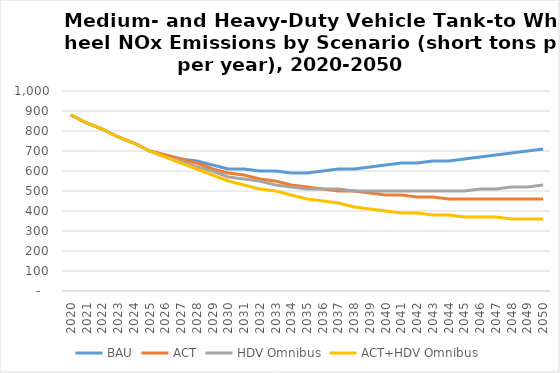
| Category | BAU | ACT | HDV Omnibus | ACT+HDV Omnibus |
|---|---|---|---|---|
| 2020.0 | 880 | 880 | 880 | 880 |
| 2021.0 | 840 | 840 | 840 | 840 |
| 2022.0 | 810 | 810 | 810 | 810 |
| 2023.0 | 770 | 770 | 770 | 770 |
| 2024.0 | 740 | 740 | 740 | 740 |
| 2025.0 | 700 | 700 | 700 | 700 |
| 2026.0 | 680 | 680 | 670 | 670 |
| 2027.0 | 660 | 660 | 650 | 640 |
| 2028.0 | 650 | 640 | 620 | 610 |
| 2029.0 | 630 | 610 | 600 | 580 |
| 2030.0 | 610 | 590 | 570 | 550 |
| 2031.0 | 610 | 580 | 560 | 530 |
| 2032.0 | 600 | 560 | 550 | 510 |
| 2033.0 | 600 | 550 | 530 | 500 |
| 2034.0 | 590 | 530 | 520 | 480 |
| 2035.0 | 590 | 520 | 510 | 460 |
| 2036.0 | 600 | 510 | 510 | 450 |
| 2037.0 | 610 | 500 | 510 | 440 |
| 2038.0 | 610 | 500 | 500 | 420 |
| 2039.0 | 620 | 490 | 500 | 410 |
| 2040.0 | 630 | 480 | 500 | 400 |
| 2041.0 | 640 | 480 | 500 | 390 |
| 2042.0 | 640 | 470 | 500 | 390 |
| 2043.0 | 650 | 470 | 500 | 380 |
| 2044.0 | 650 | 460 | 500 | 380 |
| 2045.0 | 660 | 460 | 500 | 370 |
| 2046.0 | 670 | 460 | 510 | 370 |
| 2047.0 | 680 | 460 | 510 | 370 |
| 2048.0 | 690 | 460 | 520 | 360 |
| 2049.0 | 700 | 460 | 520 | 360 |
| 2050.0 | 710 | 460 | 530 | 360 |